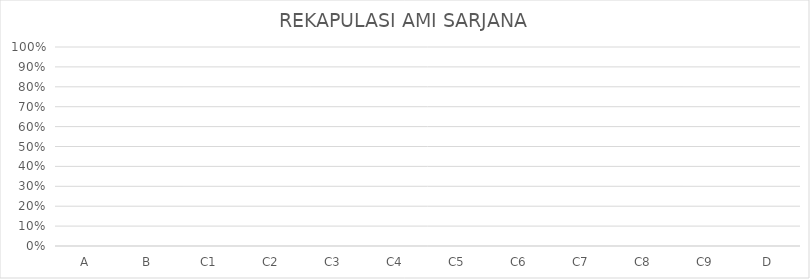
| Category | REKAPULASI AMI SARJANA |
|---|---|
| A | 0 |
| B | 0 |
| C1 | 0 |
| C2 | 0 |
| C3 | 0 |
| C4 | 0 |
| C5 | 0 |
| C6 | 0 |
| C7 | 0 |
| C8 | 0 |
| C9 | 0 |
| D | 0 |